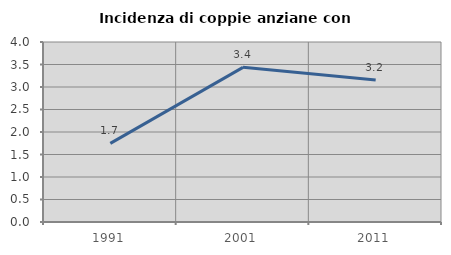
| Category | Incidenza di coppie anziane con figli |
|---|---|
| 1991.0 | 1.748 |
| 2001.0 | 3.437 |
| 2011.0 | 3.158 |